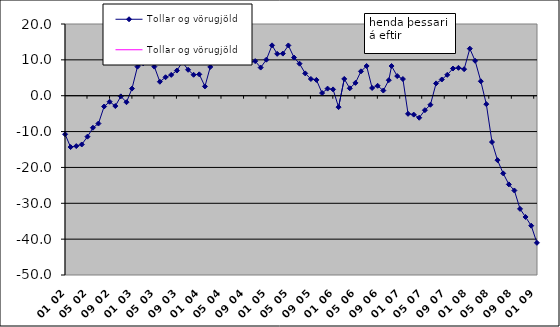
| Category | Tollar og vörugjöld |
|---|---|
| 2002-01-15 06:00:00 |  |
| 2002-02-14 16:30:00 |  |
| 2002-03-17 03:00:00 |  |
| 2002-04-16 13:30:00 |  |
| 2002-05-17 |  |
| 2002-06-16 10:30:00 |  |
| 2002-07-16 21:00:00 |  |
| 2002-08-16 07:30:00 |  |
| 2002-09-15 18:00:00 |  |
| 2002-10-16 04:30:00 |  |
| 2002-11-15 15:00:00 |  |
| 2002-12-16 01:30:00 |  |
| 2003-01-15 12:00:00 |  |
| 2003-02-14 22:30:00 |  |
| 2003-03-17 09:00:00 |  |
| 2003-04-16 19:30:00 |  |
| 2003-05-17 06:00:00 |  |
| 2003-06-16 16:30:00 |  |
| 2003-07-17 03:00:00 |  |
| 2003-08-17 |  |
| 2003-09-17 |  |
| 2003-10-17 |  |
| 2003-11-17 |  |
| 2003-12-17 |  |
| 2004-01-17 |  |
| 2004-02-17 |  |
| 2004-03-17 |  |
| 2004-04-17 |  |
| 2004-05-17 |  |
| 2004-06-17 |  |
| 2004-07-17 |  |
| 2004-08-17 |  |
| 2004-09-17 |  |
| 2004-10-17 |  |
| 2004-11-17 |  |
| 2004-12-17 |  |
| 2005-01-17 |  |
| 2005-02-17 |  |
| 2005-03-17 |  |
| 2005-04-17 |  |
| 2005-05-17 |  |
| 2005-06-17 |  |
| 2005-07-17 |  |
| 2005-08-17 |  |
| 2005-09-17 |  |
| 2005-10-17 |  |
| 2005-11-17 |  |
| 2005-12-17 |  |
| 2006-01-16 10:30:00 |  |
| 2006-02-15 21:00:00 |  |
| 2006-03-18 07:30:00 |  |
| 2006-04-17 18:00:00 |  |
| 2006-05-18 04:30:00 |  |
| 2006-06-17 15:00:00 |  |
| 2006-07-18 01:30:00 |  |
| 2006-08-17 12:00:00 |  |
| 2006-09-16 22:30:00 |  |
| 2006-10-17 09:00:00 |  |
| 2006-11-16 19:30:00 |  |
| 2006-12-01 |  |
| 2007-01-01 |  |
| 2007-02-01 |  |
| 2007-03-01 |  |
| 2007-04-01 |  |
| 2007-05-01 |  |
| 2007-06-01 |  |
| 2007-07-01 |  |
| 2007-08-01 |  |
| 2007-09-01 |  |
| 2007-10-01 |  |
| 2007-11-01 |  |
| 2007-12-01 |  |
| 2008-01-01 |  |
| 2008-02-01 |  |
| 2008-03-01 |  |
| 2008-04-01 |  |
| 2008-05-01 |  |
| 2008-06-01 |  |
| 2008-07-01 |  |
| 2008-08-01 |  |
| 2008-09-01 |  |
| 2008-10-01 |  |
| 2008-11-01 |  |
| 2008-12-01 |  |
| 2009-01-01 |  |
| 2009-02-01 |  |